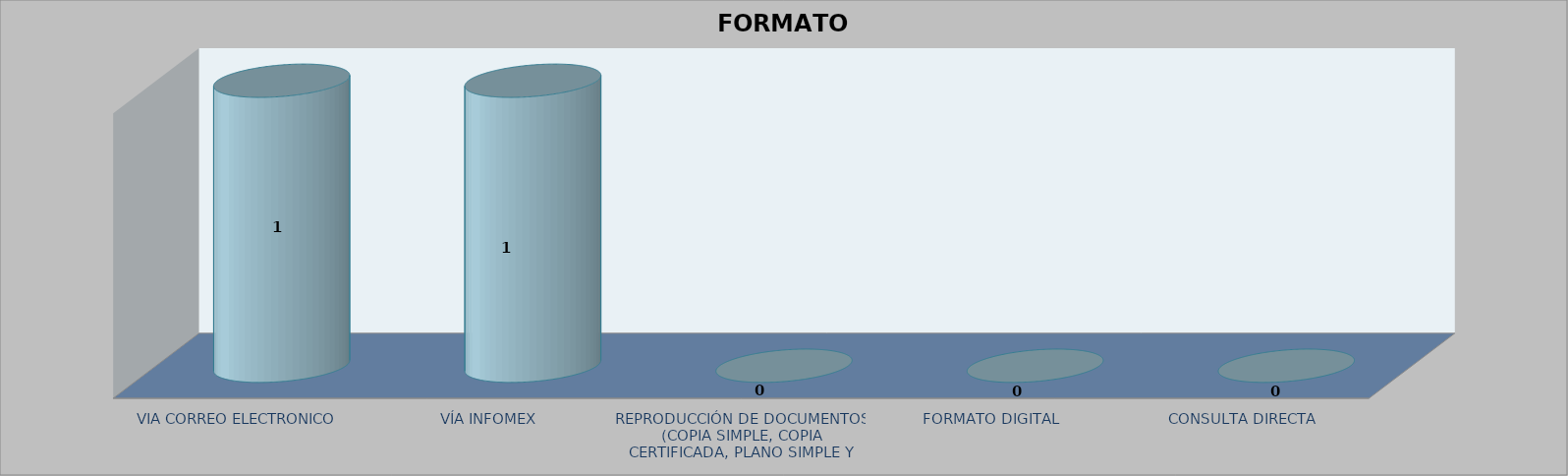
| Category |        FORMATO SOLICITADO | Series 1 | Series 2 |
|---|---|---|---|
| VIA CORREO ELECTRONICO |  |  | 1 |
| VÍA INFOMEX |  |  | 1 |
| REPRODUCCIÓN DE DOCUMENTOS (COPIA SIMPLE, COPIA CERTIFICADA, PLANO SIMPLE Y PLANO CERTIFICADO) |  |  | 0 |
| FORMATO DIGITAL |  |  | 0 |
| CONSULTA DIRECTA |  |  | 0 |